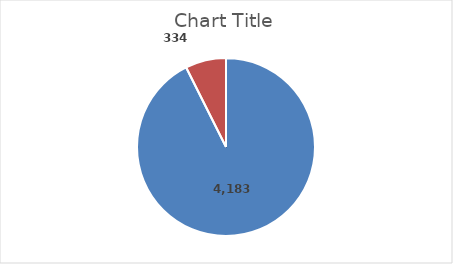
| Category | Series 0 |
|---|---|
| Hombres | 0.926 |
| Mujeres | 0.074 |